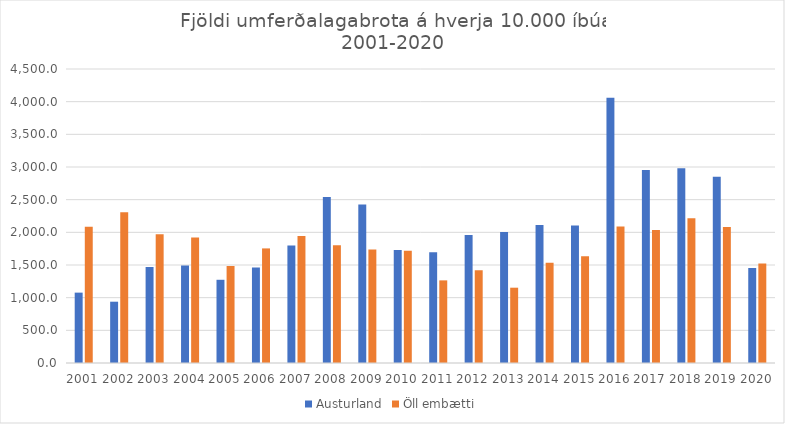
| Category | Austurland | Öll embætti |
|---|---|---|
| 2001.0 | 1077.117 | 2084.787 |
| 2002.0 | 938.295 | 2307.249 |
| 2003.0 | 1467.937 | 1971.43 |
| 2004.0 | 1492.726 | 1919.133 |
| 2005.0 | 1273.711 | 1483.29 |
| 2006.0 | 1460.977 | 1753.951 |
| 2007.0 | 1800 | 1945.219 |
| 2008.0 | 2541.544 | 1802.686 |
| 2009.0 | 2424.53 | 1737.431 |
| 2010.0 | 1731.476 | 1717.923 |
| 2011.0 | 1693.293 | 1264.617 |
| 2012.0 | 1958.854 | 1419.48 |
| 2013.0 | 2003.366 | 1152.691 |
| 2014.0 | 2111.111 | 1532.536 |
| 2015.0 | 2104.038 | 1635.086 |
| 2016.0 | 4059.055 | 2087.473 |
| 2017.0 | 2954.556 | 2034.773 |
| 2018.0 | 2978.965 | 2216.656 |
| 2019.0 | 2851.137 | 2082.052 |
| 2020.0 | 1454.444 | 1522.91 |